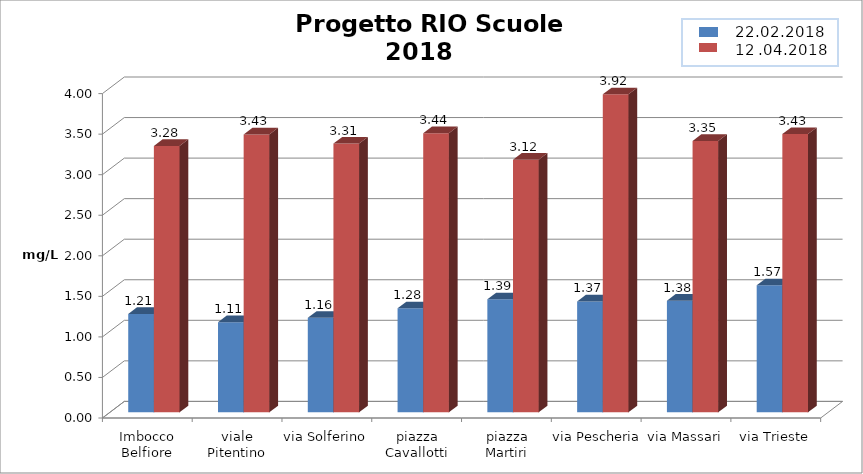
| Category | Series 0 | Series 1 |
|---|---|---|
| Imbocco Belfiore | 1.212 | 3.284 |
| viale Pitentino | 1.111 | 3.427 |
| via Solferino | 1.165 | 3.314 |
| piazza Cavallotti | 1.282 | 3.442 |
| piazza Martiri | 1.393 | 3.115 |
| via Pescheria | 1.368 | 3.921 |
| via Massari | 1.377 | 3.345 |
| via Trieste | 1.567 | 3.431 |